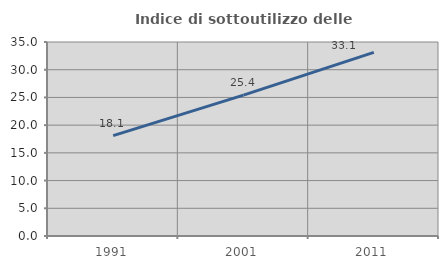
| Category | Indice di sottoutilizzo delle abitazioni  |
|---|---|
| 1991.0 | 18.098 |
| 2001.0 | 25.411 |
| 2011.0 | 33.126 |